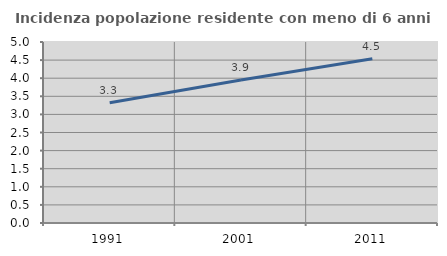
| Category | Incidenza popolazione residente con meno di 6 anni |
|---|---|
| 1991.0 | 3.323 |
| 2001.0 | 3.948 |
| 2011.0 | 4.534 |